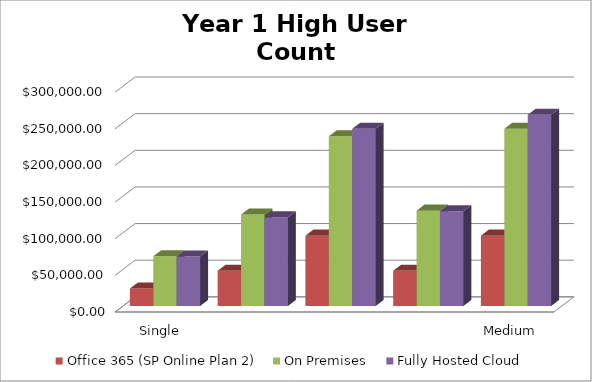
| Category | Office 365 (SP Online Plan 2)  | On Premises   | Fully Hosted Cloud   |
|---|---|---|---|
| Single Server Install (WFE and SQL on 1 VM) | 24000 | 67760.412 | 67540 |
| Small Farm - Two Server Install (WFE and SQL) | 48000 | 124982.444 | 120920 |
| Small Farm w/ High Availability (2 WFE - 2 SQL) | 96000 | 231594.125 | 241900 |
| Medium Farm (1 WFE, 1 App/Index, 1 SQL) | 48000 | 130112.403 | 129320 |
| Medium Farm w/ High Availability (2 WFE, 2 A/I, 2 SQL) | 96000 | 241943.177 | 260980 |